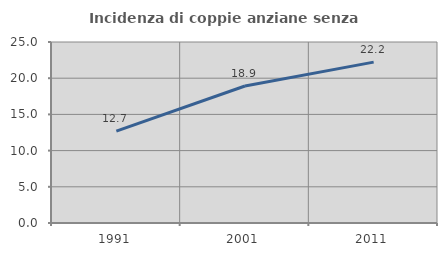
| Category | Incidenza di coppie anziane senza figli  |
|---|---|
| 1991.0 | 12.695 |
| 2001.0 | 18.919 |
| 2011.0 | 22.222 |